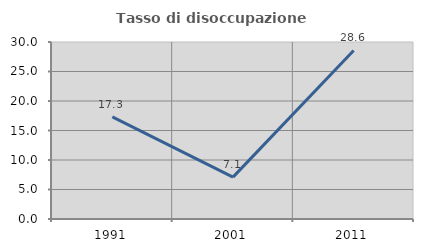
| Category | Tasso di disoccupazione giovanile  |
|---|---|
| 1991.0 | 17.303 |
| 2001.0 | 7.095 |
| 2011.0 | 28.571 |